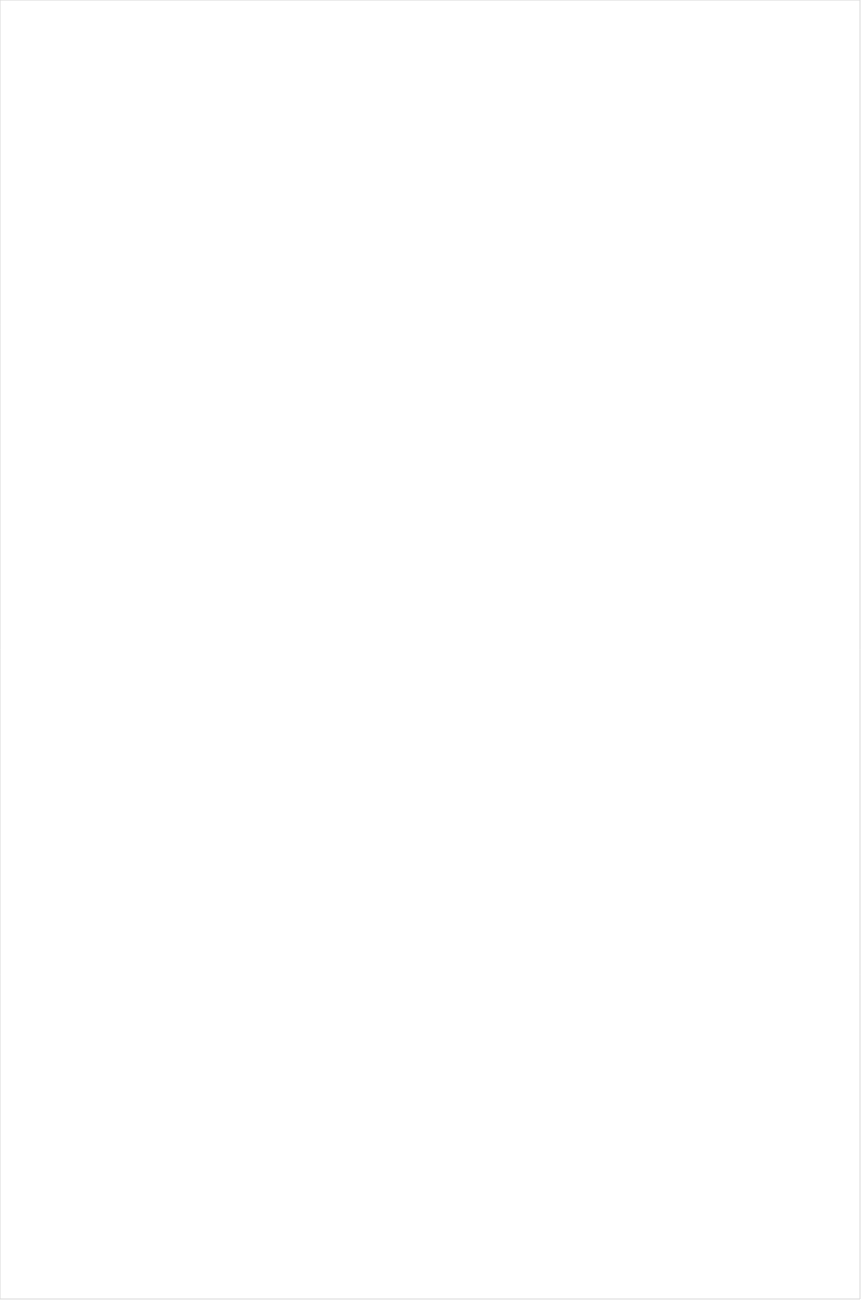
| Category | Total |
|---|---|
| UniMas | -0.522 |
| Hallmark Movies & Mysteries | -0.518 |
| RFD TV | -0.49 |
| Telemundo | -0.468 |
| Hallmark | -0.466 |
| PBS | -0.417 |
| Travel | -0.388 |
| Univision | -0.372 |
| UP TV | -0.353 |
| Discovery Life Channel | -0.316 |
| Galavision | -0.305 |
| Science Channel | -0.273 |
| CMTV | -0.252 |
| NBC Universo | -0.245 |
| Fox News | -0.245 |
| INSP | -0.238 |
| Great American Country | -0.232 |
| WGN America | -0.218 |
| Outdoor Channel | -0.207 |
| CBS | -0.187 |
| Animal Planet | -0.185 |
| Cartoon Network | -0.17 |
| ION | -0.165 |
| Smithsonian | -0.153 |
| TLC | -0.14 |
| Investigation Discovery | -0.14 |
| MyNetworkTV | -0.138 |
| History Channel | -0.135 |
| Fox Business | -0.108 |
| NBC | -0.101 |
| Weather Channel | -0.1 |
| DIY | -0.1 |
| The Sportsman Channel | -0.08 |
| TV LAND | -0.077 |
| CW | -0.073 |
| Discovery Channel | -0.073 |
| HGTV | -0.07 |
| Motor Trend Network | -0.056 |
| POP | -0.045 |
| ABC | -0.026 |
| FYI | -0.018 |
| Logo | -0.012 |
| OXYGEN | -0.004 |
| Ovation | 0.002 |
| American Heroes Channel | 0.009 |
| TUDN | 0.009 |
| Discovery Family Channel | 0.011 |
| FOX | 0.031 |
| Nick@Nite | 0.034 |
| E! | 0.058 |
| Freeform | 0.06 |
| National Geographic | 0.075 |
| SundanceTV | 0.087 |
| National Geographic Wild | 0.09 |
| Reelz Channel | 0.09 |
| Lifetime Movies | 0.095 |
| Headline News | 0.095 |
| A&E | 0.095 |
| FX Movie Channel | 0.104 |
| Food Network | 0.105 |
| Nick | 0.114 |
| Disney Junior US | 0.123 |
| WE TV | 0.131 |
| Universal Kids | 0.146 |
| BRAVO | 0.148 |
| Destination America | 0.153 |
| Disney Channel | 0.156 |
| BBC America | 0.175 |
| SYFY | 0.183 |
| Disney XD | 0.186 |
| Adult Swim | 0.19 |
| Bloomberg HD | 0.191 |
| Nick Jr. | 0.204 |
| Paramount Network | 0.211 |
| Lifetime | 0.261 |
| AMC | 0.269 |
| MSNBC | 0.273 |
| Nick Toons | 0.28 |
| MTV | 0.319 |
| Oprah Winfrey Network | 0.319 |
| truTV | 0.353 |
| Game Show | 0.356 |
| Cooking Channel | 0.373 |
| FXX | 0.395 |
| Independent Film (IFC) | 0.395 |
| TBS | 0.442 |
| Comedy Central | 0.453 |
| Teen Nick | 0.46 |
| FX | 0.468 |
| CNBC | 0.472 |
| Viceland | 0.494 |
| USA Network | 0.509 |
| NBC Sports | 0.693 |
| TNT | 0.716 |
| NHL | 0.717 |
| CNN | 0.785 |
| Golf | 0.909 |
| MTV2 | 0.983 |
| VH1 | 1.074 |
| FXDEP | 1.159 |
| BET | 1.176 |
| ESPN Deportes | 1.192 |
| Olympic Channel | 1.24 |
| MLB Network | 1.279 |
| PAC-12 Network | 1.366 |
| Big Ten Network | 1.465 |
| Tennis Channel | 1.5 |
| BET Her | 1.525 |
| TV ONE | 1.594 |
| Fox Sports 1 | 1.977 |
| ESPNU | 2.393 |
| CBS Sports | 2.621 |
| NFL Network | 2.624 |
| ESPNEWS | 3.002 |
| ESPN2 | 3.438 |
| ESPN | 3.457 |
| NBA TV | 7.284 |